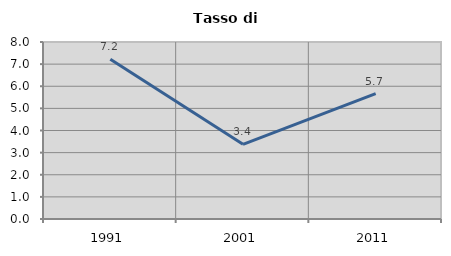
| Category | Tasso di disoccupazione   |
|---|---|
| 1991.0 | 7.225 |
| 2001.0 | 3.375 |
| 2011.0 | 5.664 |